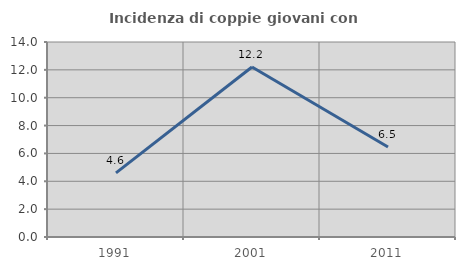
| Category | Incidenza di coppie giovani con figli |
|---|---|
| 1991.0 | 4.608 |
| 2001.0 | 12.207 |
| 2011.0 | 6.466 |